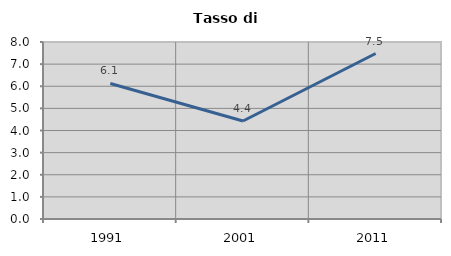
| Category | Tasso di disoccupazione   |
|---|---|
| 1991.0 | 6.125 |
| 2001.0 | 4.429 |
| 2011.0 | 7.48 |